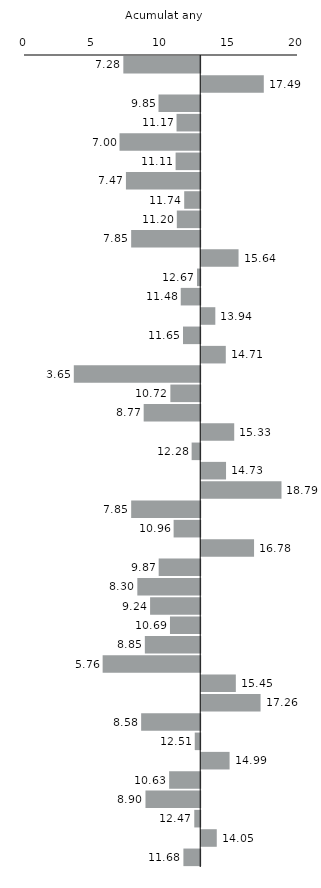
| Category | Series 0 |
|---|---|
| Alt Camp | 7.277 |
| Alt Empordà | 17.494 |
| Alt Penedès | 9.854 |
| Alt Urgell | 11.175 |
| Alta Ribagorça | 6.998 |
| Anoia | 11.106 |
| Aran | 7.468 |
| Bages | 11.737 |
| Baix Camp | 11.196 |
| Baix Ebre | 7.851 |
| Baix Empordà | 15.645 |
| Baix Llobregat | 12.672 |
| Baix Penedès | 11.483 |
| Barcelonès | 13.943 |
| Berguedà | 11.648 |
| Cerdanya | 14.71 |
| Conca de Barberà | 3.649 |
| Garraf | 10.723 |
| Garrigues | 8.767 |
| Garrotxa | 15.328 |
| Gironès | 12.28 |
| Maresme | 14.728 |
| Moianès | 18.79 |
| Montsià | 7.852 |
| Noguera | 10.961 |
| Osona | 16.782 |
| Pallars Jussà | 9.866 |
| Pallars Sobirà | 8.303 |
| Pla d'Urgell | 9.238 |
| Pla de l'Estany | 10.694 |
| Priorat | 8.852 |
| Ribera d'Ebre | 5.761 |
| Ripollès | 15.446 |
| Segarra | 17.256 |
| Segrià | 8.583 |
| Selva | 12.509 |
| Solsonès | 14.987 |
| Tarragonès | 10.634 |
| Terra Alta | 8.899 |
| Urgell | 12.475 |
| Vallès Occidental | 14.049 |
| Vallès Oriental | 11.678 |